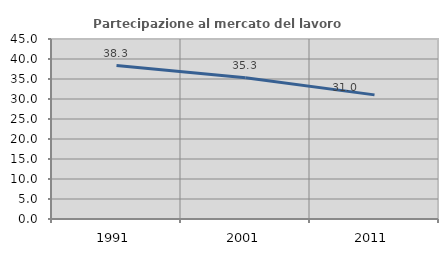
| Category | Partecipazione al mercato del lavoro  femminile |
|---|---|
| 1991.0 | 38.346 |
| 2001.0 | 35.318 |
| 2011.0 | 31.031 |